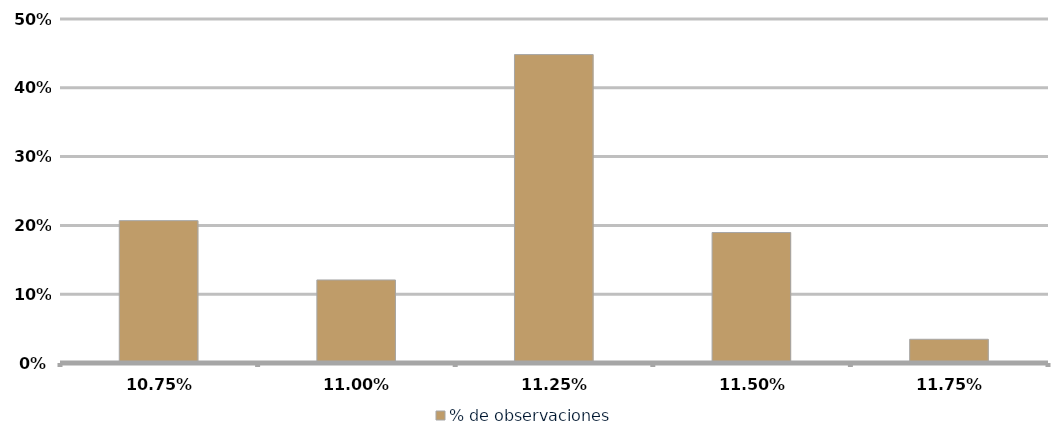
| Category | % de observaciones  |
|---|---|
| 0.1075 | 0.207 |
| 0.11 | 0.121 |
| 0.1125 | 0.448 |
| 0.115 | 0.19 |
| 0.11750000000000001 | 0.034 |